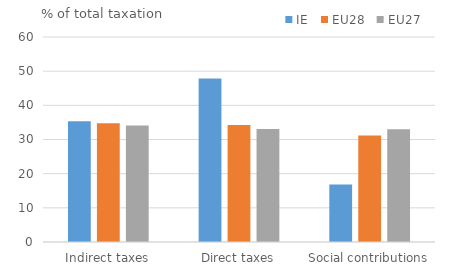
| Category | IE | EU28 | EU27 |
|---|---|---|---|
| Indirect taxes | 35.326 | 34.748 | 34.122 |
| Direct taxes | 47.852 | 34.27 | 33.09 |
| Social contributions | 16.822 | 31.135 | 32.964 |